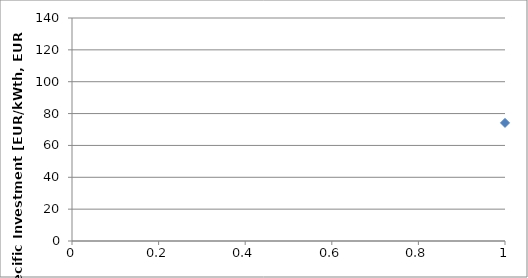
| Category | upper ends |
|---|---|
| 0 | 74.139 |
| 1 | 119.763 |
| 2 | 45.624 |
| 3 | 82.349 |
| 4 | 51.449 |
| 5 | 33.074 |
| 6 | 73.129 |
| 7 | 51.22 |
| 8 | 49.599 |